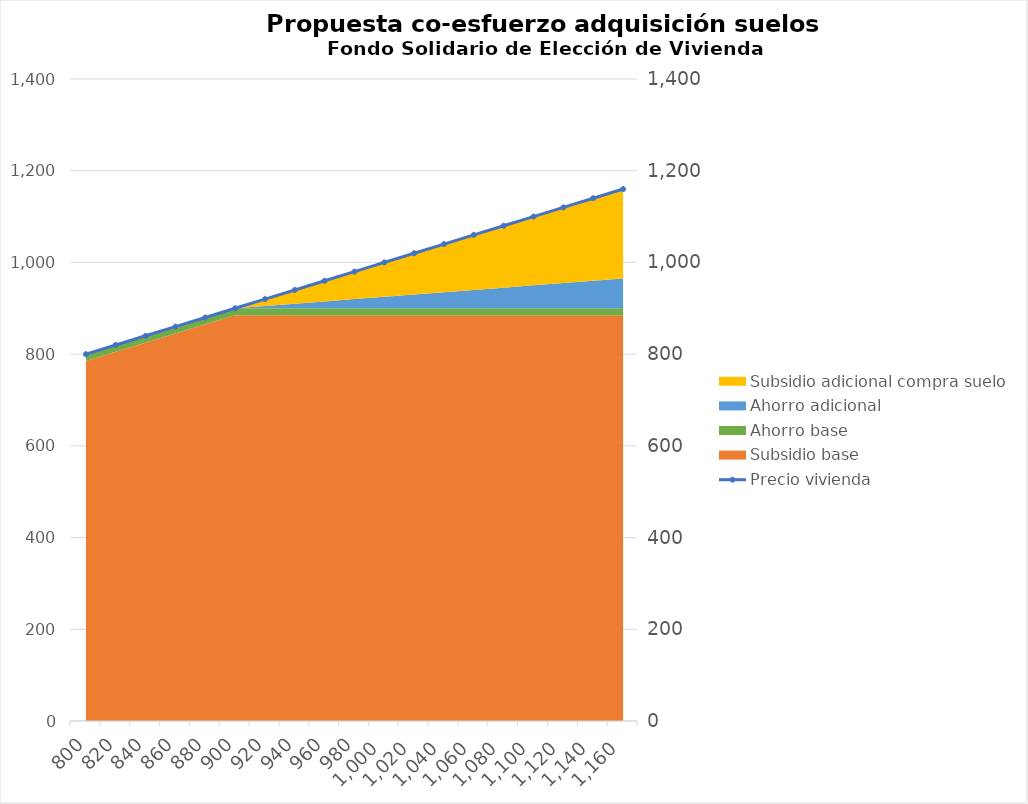
| Category | Precio vivienda |
|---|---|
| 800.0 | 800 |
| 820.0 | 820 |
| 840.0 | 840 |
| 860.0 | 860 |
| 880.0 | 880 |
| 900.0 | 900 |
| 920.0 | 920 |
| 940.0 | 940 |
| 960.0 | 960 |
| 980.0 | 980 |
| 1000.0 | 1000 |
| 1020.0 | 1020 |
| 1040.0 | 1040 |
| 1060.0 | 1060 |
| 1080.0 | 1080 |
| 1100.0 | 1100 |
| 1120.0 | 1120 |
| 1140.0 | 1140 |
| 1160.0 | 1160 |